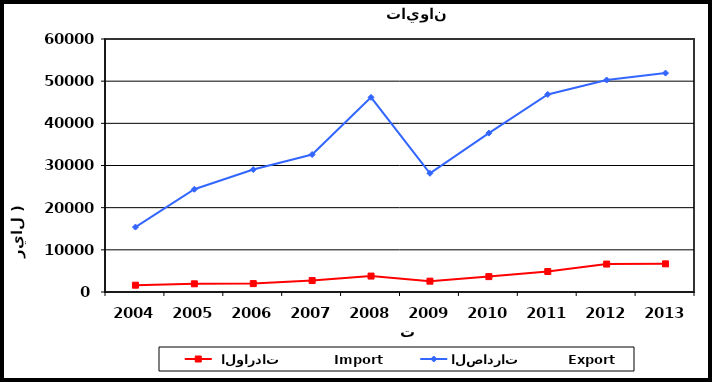
| Category |  الواردات           Import | الصادرات          Export |
|---|---|---|
| 2004.0 | 1615 | 15396 |
| 2005.0 | 1943 | 24366 |
| 2006.0 | 1992 | 29044 |
| 2007.0 | 2717 | 32605 |
| 2008.0 | 3778 | 46165 |
| 2009.0 | 2570 | 28151 |
| 2010.0 | 3649 | 37685 |
| 2011.0 | 4853 | 46848 |
| 2012.0 | 6622 | 50277 |
| 2013.0 | 6675 | 51921 |